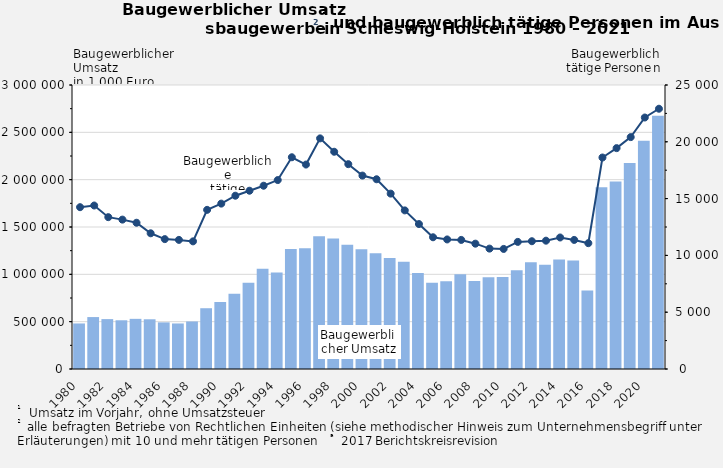
| Category | Baugewerblicher 
Umsatz in 1000 Euro |
|---|---|
| 1980.0 | 481176 |
| 1981.0 | 548606 |
| 1982.0 | 527072 |
| 1983.0 | 514714 |
| 1984.0 | 529751 |
| 1985.0 | 525282 |
| 1986.0 | 492517 |
| 1987.0 | 480997 |
| 1988.0 | 502088 |
| 1989.0 | 641996 |
| 1990.0 | 708757 |
| 1991.0 | 795322 |
| 1992.0 | 910513 |
| 1993.0 | 1057892 |
| 1994.0 | 1020468 |
| 1995.0 | 1267202 |
| 1996.0 | 1274585 |
| 1997.0 | 1402303 |
| 1998.0 | 1377951 |
| 1999.0 | 1313100 |
| 2000.0 | 1264873 |
| 2001.0 | 1222932 |
| 2002.0 | 1173826 |
| 2003.0 | 1132688 |
| 2004.0 | 1014311 |
| 2005.0 | 909914 |
| 2006.0 | 925834 |
| 2007.0 | 1001274 |
| 2008.0 | 930127 |
| 2009.0 | 969939 |
| 2010.0 | 971758 |
| 2011.0 | 1042728 |
| 2012.0 | 1128002 |
| 2013.0 | 1101137 |
| 2014.0 | 1156305 |
| 2015.0 | 1144920 |
| 2016.0 | 828538 |
| 2017.0 | 1920283 |
| 2018.0 | 1980842 |
| 2019.0 | 2175144.56 |
| 2020.0 | 2412149 |
| 2021.0 | 2675786 |